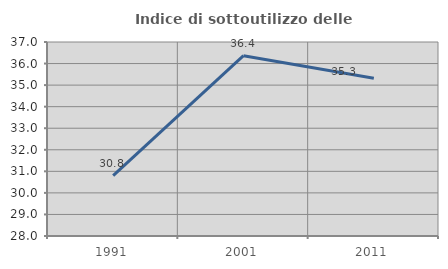
| Category | Indice di sottoutilizzo delle abitazioni  |
|---|---|
| 1991.0 | 30.801 |
| 2001.0 | 36.364 |
| 2011.0 | 35.314 |